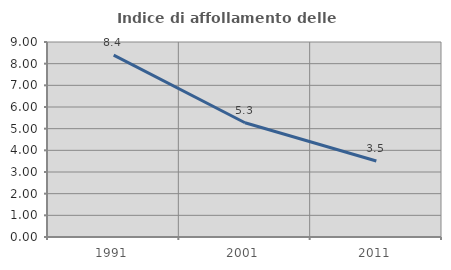
| Category | Indice di affollamento delle abitazioni  |
|---|---|
| 1991.0 | 8.395 |
| 2001.0 | 5.272 |
| 2011.0 | 3.506 |